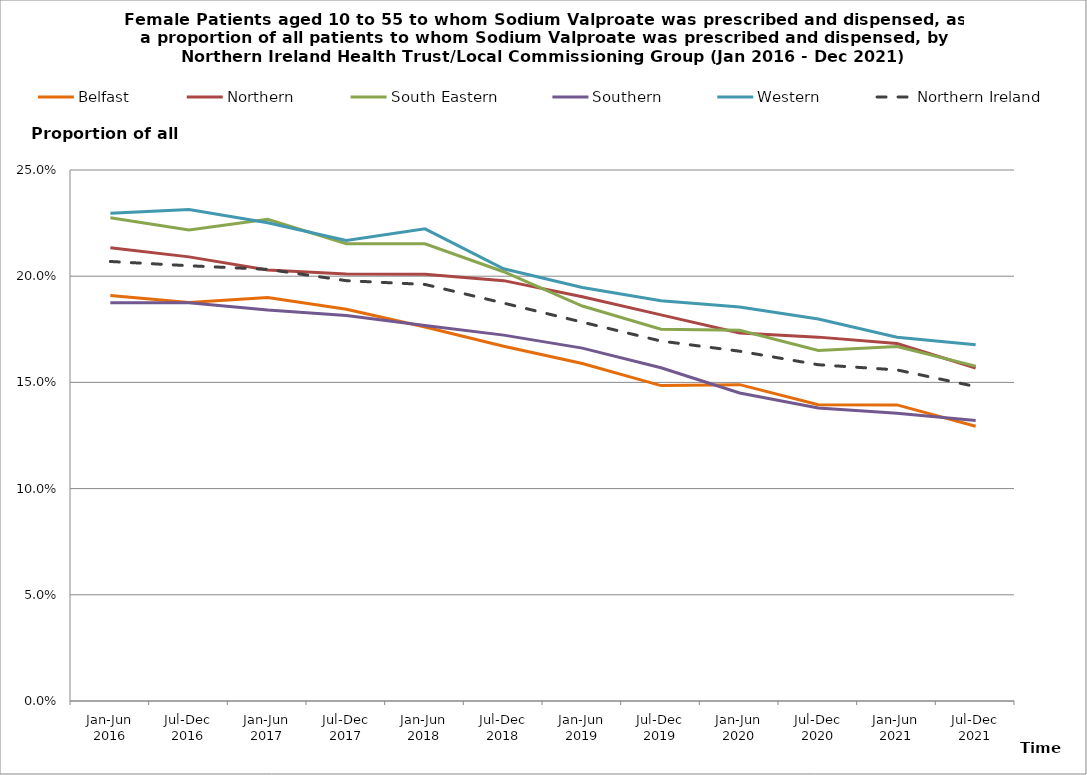
| Category | Belfast | Northern | South Eastern | Southern | Western | Northern Ireland |
|---|---|---|---|---|---|---|
| Jan-Jun 2016 | 0.191 | 0.213 | 0.228 | 0.188 | 0.23 | 0.207 |
| Jul-Dec 2016 | 0.188 | 0.209 | 0.222 | 0.188 | 0.231 | 0.205 |
| Jan-Jun 2017 | 0.19 | 0.203 | 0.227 | 0.184 | 0.225 | 0.203 |
| Jul-Dec 2017 | 0.184 | 0.201 | 0.215 | 0.182 | 0.217 | 0.198 |
| Jan-Jun 2018 | 0.176 | 0.201 | 0.215 | 0.177 | 0.222 | 0.196 |
| Jul-Dec 2018 | 0.167 | 0.198 | 0.202 | 0.172 | 0.203 | 0.187 |
| Jan-Jun 2019 | 0.159 | 0.19 | 0.186 | 0.166 | 0.195 | 0.178 |
| Jul-Dec 2019 | 0.148 | 0.182 | 0.175 | 0.157 | 0.188 | 0.169 |
| Jan-Jun 2020 | 0.149 | 0.173 | 0.175 | 0.145 | 0.186 | 0.165 |
| Jul-Dec 2020 | 0.139 | 0.171 | 0.165 | 0.138 | 0.18 | 0.158 |
| Jan-Jun 2021 | 0.139 | 0.168 | 0.167 | 0.136 | 0.171 | 0.156 |
| Jul-Dec 2021 | 0.129 | 0.157 | 0.158 | 0.132 | 0.168 | 0.148 |